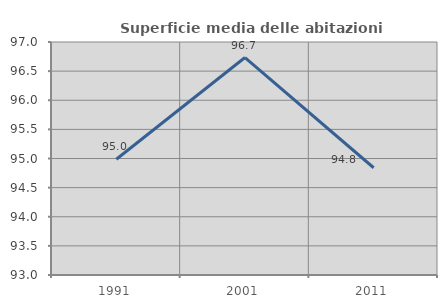
| Category | Superficie media delle abitazioni occupate |
|---|---|
| 1991.0 | 94.988 |
| 2001.0 | 96.733 |
| 2011.0 | 94.841 |